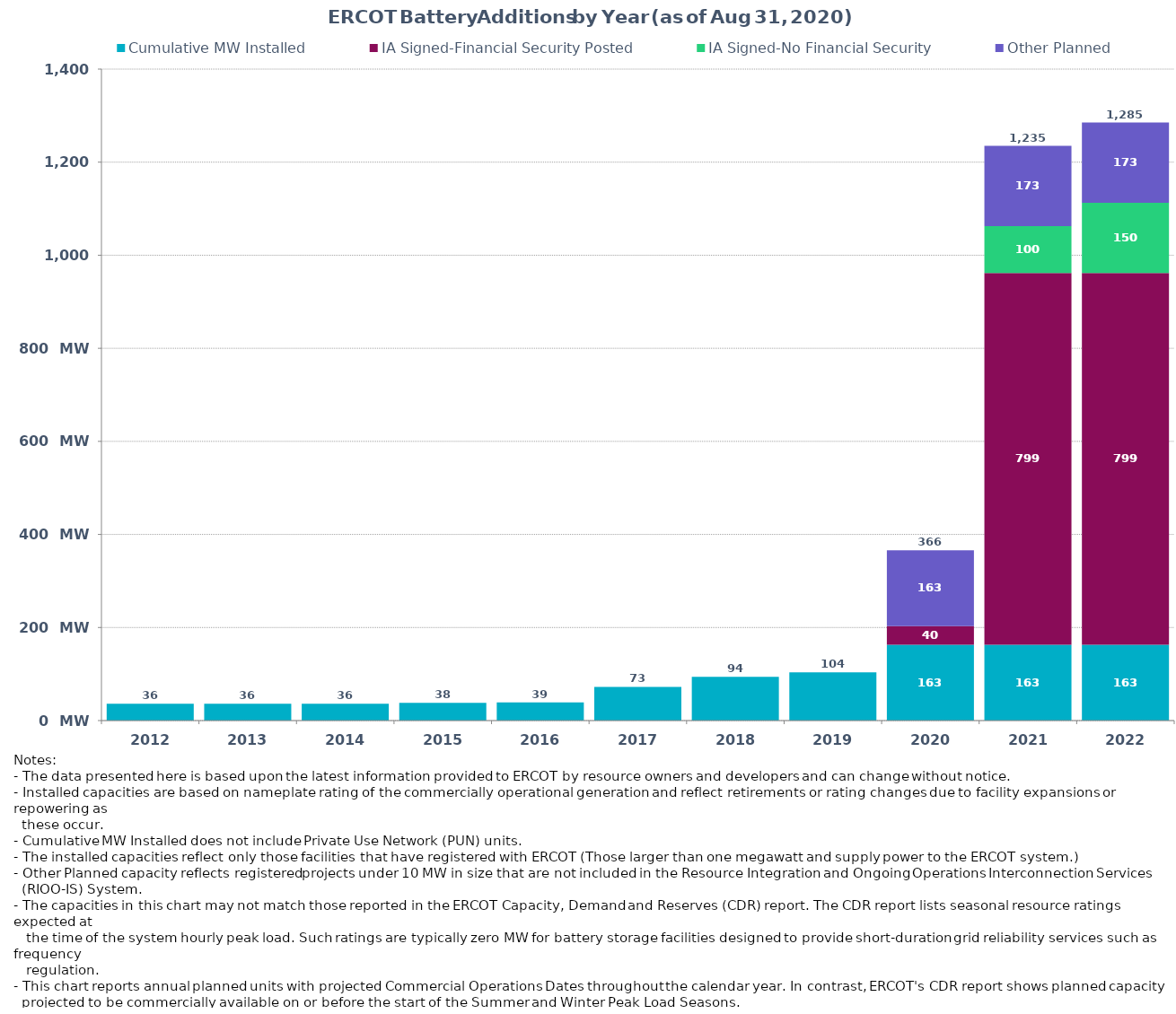
| Category | Cumulative MW Installed | Cumulative MW Synchronized | IA Signed-Financial Security Posted  | IA Signed-No Financial Security  | Other Planned | Cumulative Installed and Planned |
|---|---|---|---|---|---|---|
| 2012.0 | 36 | 0 | 0 | 0 | 0 | 36 |
| 2013.0 | 36 | 0 | 0 | 0 | 0 | 36 |
| 2014.0 | 36 | 0 | 0 | 0 | 0 | 36 |
| 2015.0 | 38 | 0 | 0 | 0 | 0 | 38 |
| 2016.0 | 39 | 0 | 0 | 0 | 0 | 39 |
| 2017.0 | 72.5 | 0 | 0 | 0 | 0 | 72.5 |
| 2018.0 | 93.8 | 0 | 0 | 0 | 0 | 93.8 |
| 2019.0 | 103.7 | 0 | 0 | 0 | 0 | 103.7 |
| 2020.0 | 163.15 | 0 | 40 | 0 | 163 | 366.15 |
| 2021.0 | 163.15 | 0 | 798.83 | 100.49 | 172.63 | 1235.1 |
| 2022.0 | 163.15 | 0 | 798.83 | 150.49 | 172.63 | 1285.1 |